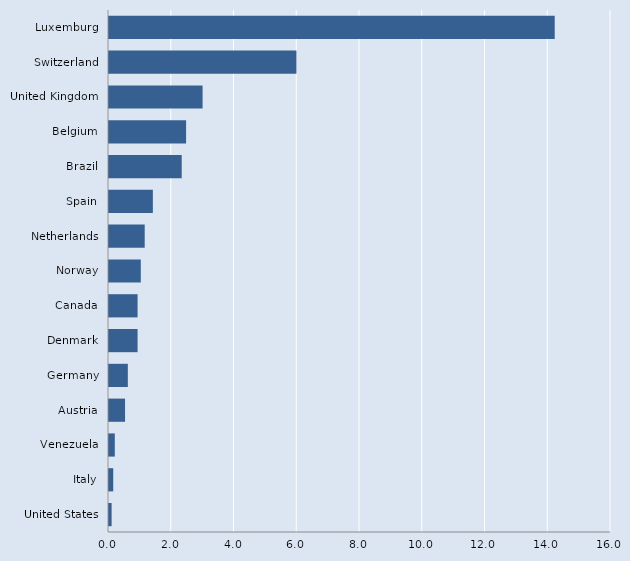
| Category | Series 0 |
|---|---|
| United States | 0.083 |
| Italy | 0.135 |
| Venezuela | 0.185 |
| Austria | 0.512 |
| Germany | 0.6 |
| Denmark | 0.911 |
| Canada | 0.911 |
| Norway | 1.013 |
| Netherlands | 1.138 |
| Spain | 1.398 |
| Brazil | 2.317 |
| Belgium | 2.457 |
| United Kingdom | 2.983 |
| Switzerland | 5.974 |
| Luxemburg | 14.206 |